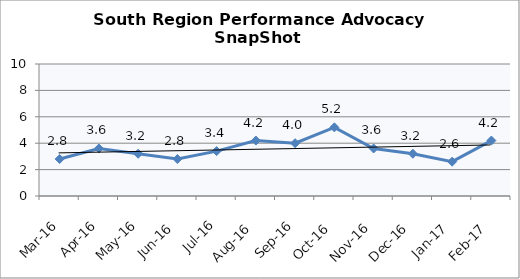
| Category | South Region |
|---|---|
| Mar-16 | 2.8 |
| Apr-16 | 3.6 |
| May-16 | 3.2 |
| Jun-16 | 2.8 |
| Jul-16 | 3.4 |
| Aug-16 | 4.2 |
| Sep-16 | 4 |
| Oct-16 | 5.2 |
| Nov-16 | 3.6 |
| Dec-16 | 3.2 |
| Jan-17 | 2.6 |
| Feb-17 | 4.2 |